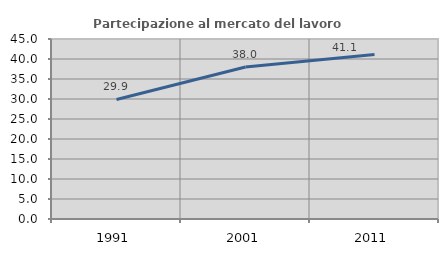
| Category | Partecipazione al mercato del lavoro  femminile |
|---|---|
| 1991.0 | 29.889 |
| 2001.0 | 38.014 |
| 2011.0 | 41.125 |